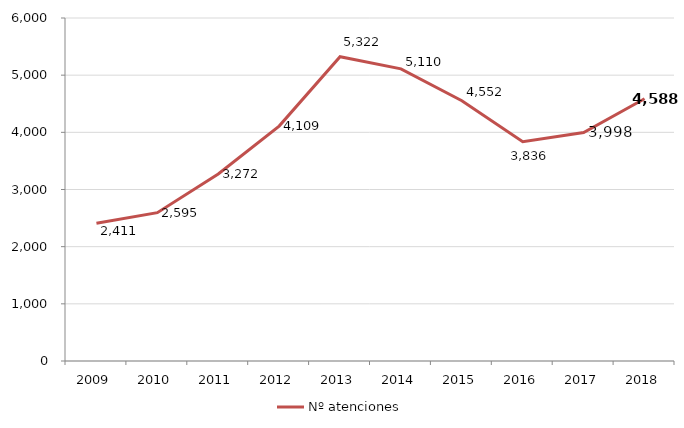
| Category | Nº atenciones |
|---|---|
| 2009.0 | 2411 |
| 2010.0 | 2595 |
| 2011.0 | 3272 |
| 2012.0 | 4109 |
| 2013.0 | 5322 |
| 2014.0 | 5110 |
| 2015.0 | 4552 |
| 2016.0 | 3836 |
| 2017.0 | 3998 |
| 2018.0 | 4588 |